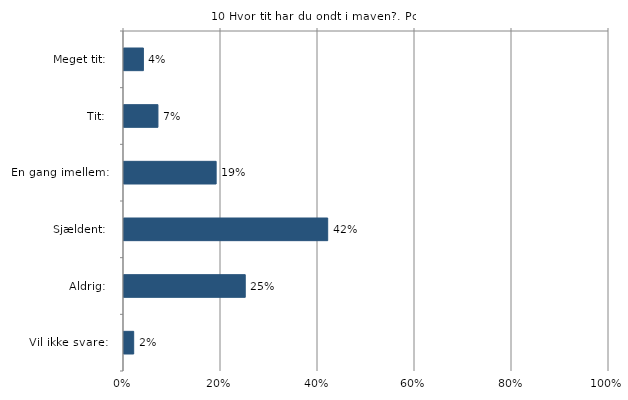
| Category | Hvor tit har du ondt i maven? |
|---|---|
| Meget tit:   | 0.04 |
| Tit:   | 0.07 |
| En gang imellem:   | 0.19 |
| Sjældent:   | 0.42 |
| Aldrig:   | 0.25 |
| Vil ikke svare:   | 0.02 |